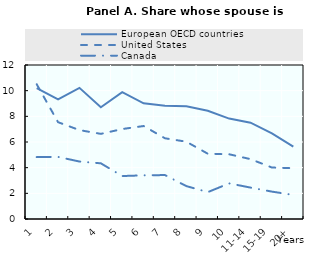
| Category | European OECD countries | United States | Canada |
|---|---|---|---|
| 1 | 10.203 | 10.5 | 4.825 |
| 2 | 9.318 | 7.544 | 4.84 |
| 3 | 10.219 | 6.927 | 4.478 |
| 4 | 8.709 | 6.634 | 4.339 |
| 5 | 9.882 | 7.01 | 3.347 |
| 6 | 9.011 | 7.244 | 3.403 |
| 7 | 8.819 | 6.289 | 3.424 |
| 8 | 8.786 | 6.022 | 2.563 |
| 9 | 8.434 | 5.086 | 2.093 |
| 10 | 7.825 | 5.044 | 2.774 |
| 11-14 | 7.503 | 4.665 | 2.448 |
| 15-19 | 6.667 | 4.011 | 2.134 |
| 20+ | 5.644 | 3.958 | 1.878 |